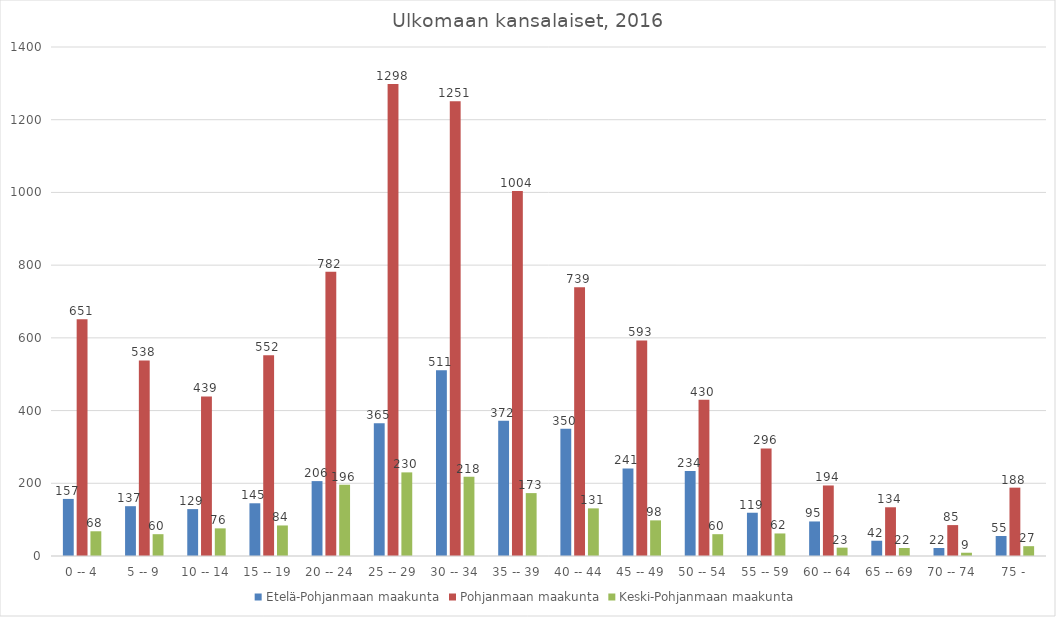
| Category | Etelä-Pohjanmaan maakunta | Pohjanmaan maakunta | Keski-Pohjanmaan maakunta |
|---|---|---|---|
| 0 -- 4 | 157 | 651 | 68 |
| 5 -- 9 | 137 | 538 | 60 |
| 10 -- 14 | 129 | 439 | 76 |
| 15 -- 19 | 145 | 552 | 84 |
| 20 -- 24 | 206 | 782 | 196 |
| 25 -- 29 | 365 | 1298 | 230 |
| 30 -- 34 | 511 | 1251 | 218 |
| 35 -- 39 | 372 | 1004 | 173 |
| 40 -- 44 | 350 | 739 | 131 |
| 45 -- 49 | 241 | 593 | 98 |
| 50 -- 54 | 234 | 430 | 60 |
| 55 -- 59 | 119 | 296 | 62 |
| 60 -- 64 | 95 | 194 | 23 |
| 65 -- 69 | 42 | 134 | 22 |
| 70 -- 74 | 22 | 85 | 9 |
| 75 - | 55 | 188 | 27 |